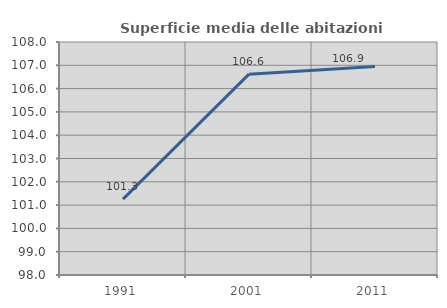
| Category | Superficie media delle abitazioni occupate |
|---|---|
| 1991.0 | 101.256 |
| 2001.0 | 106.621 |
| 2011.0 | 106.947 |